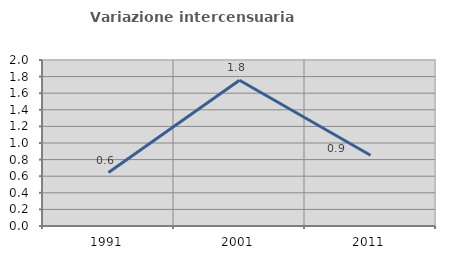
| Category | Variazione intercensuaria annua |
|---|---|
| 1991.0 | 0.644 |
| 2001.0 | 1.757 |
| 2011.0 | 0.853 |